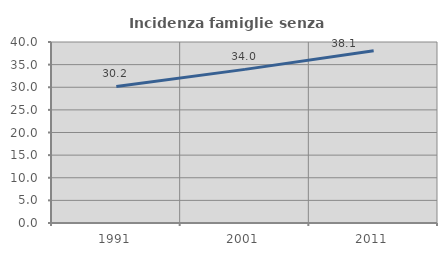
| Category | Incidenza famiglie senza nuclei |
|---|---|
| 1991.0 | 30.175 |
| 2001.0 | 33.952 |
| 2011.0 | 38.052 |